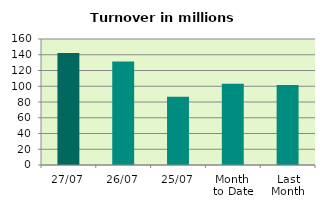
| Category | Series 0 |
|---|---|
| 27/07 | 142.355 |
| 26/07 | 131.355 |
| 25/07 | 86.67 |
| Month 
to Date | 103.188 |
| Last
Month | 101.544 |